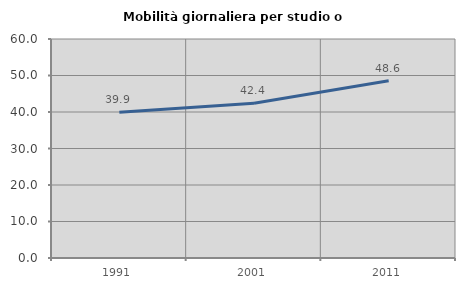
| Category | Mobilità giornaliera per studio o lavoro |
|---|---|
| 1991.0 | 39.903 |
| 2001.0 | 42.412 |
| 2011.0 | 48.574 |